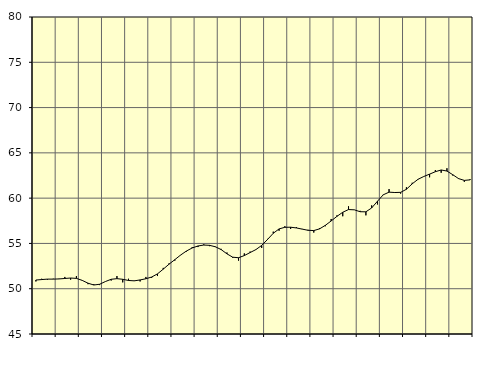
| Category | Piggar | Samtliga anställda (inkl. anställda utomlands) |
|---|---|---|
| nan | 50.8 | 50.96 |
| 1.0 | 51.1 | 51.01 |
| 1.0 | 51 | 51.06 |
| 1.0 | 51.1 | 51.06 |
| nan | 51.1 | 51.08 |
| 2.0 | 51.3 | 51.13 |
| 2.0 | 51 | 51.18 |
| 2.0 | 51.4 | 51.14 |
| nan | 50.9 | 50.92 |
| 3.0 | 50.5 | 50.61 |
| 3.0 | 50.5 | 50.41 |
| 3.0 | 50.4 | 50.49 |
| nan | 50.8 | 50.79 |
| 4.0 | 50.9 | 51.04 |
| 4.0 | 51.4 | 51.11 |
| 4.0 | 50.7 | 51.04 |
| nan | 51.1 | 50.91 |
| 5.0 | 50.9 | 50.87 |
| 5.0 | 50.8 | 50.97 |
| 5.0 | 51.3 | 51.1 |
| nan | 51.2 | 51.29 |
| 6.0 | 51.4 | 51.64 |
| 6.0 | 52.3 | 52.16 |
| 6.0 | 52.8 | 52.71 |
| nan | 53.1 | 53.21 |
| 7.0 | 53.7 | 53.72 |
| 7.0 | 54.1 | 54.16 |
| 7.0 | 54.6 | 54.5 |
| nan | 54.6 | 54.72 |
| 8.0 | 54.9 | 54.82 |
| 8.0 | 54.7 | 54.79 |
| 8.0 | 54.6 | 54.63 |
| nan | 54.4 | 54.32 |
| 9.0 | 54 | 53.85 |
| 9.0 | 53.4 | 53.48 |
| 9.0 | 53.1 | 53.42 |
| nan | 53.9 | 53.66 |
| 10.0 | 54.1 | 53.99 |
| 10.0 | 54.3 | 54.32 |
| 10.0 | 54.5 | 54.78 |
| nan | 55.5 | 55.43 |
| 11.0 | 56.3 | 56.12 |
| 11.0 | 56.4 | 56.6 |
| 11.0 | 56.9 | 56.78 |
| nan | 56.6 | 56.79 |
| 12.0 | 56.8 | 56.71 |
| 12.0 | 56.6 | 56.58 |
| 12.0 | 56.5 | 56.45 |
| nan | 56.2 | 56.42 |
| 13.0 | 56.7 | 56.61 |
| 13.0 | 56.9 | 57 |
| 13.0 | 57.7 | 57.48 |
| nan | 58.1 | 57.99 |
| 14.0 | 58 | 58.44 |
| 14.0 | 59.1 | 58.74 |
| 14.0 | 58.7 | 58.71 |
| nan | 58.6 | 58.5 |
| 15.0 | 58.1 | 58.49 |
| 15.0 | 59.2 | 58.92 |
| 15.0 | 59.3 | 59.66 |
| nan | 60.4 | 60.37 |
| 16.0 | 61 | 60.66 |
| 16.0 | 60.6 | 60.62 |
| 16.0 | 60.5 | 60.64 |
| nan | 61.2 | 60.98 |
| 17.0 | 61.7 | 61.58 |
| 17.0 | 62.1 | 62.08 |
| 17.0 | 62.4 | 62.39 |
| nan | 62.3 | 62.65 |
| 18.0 | 63.1 | 62.92 |
| 18.0 | 62.8 | 63.11 |
| 18.0 | 63.3 | 62.99 |
| nan | 62.5 | 62.59 |
| 19.0 | 62.2 | 62.16 |
| 19.0 | 61.8 | 61.96 |
| 19.0 | 62.1 | 62.02 |